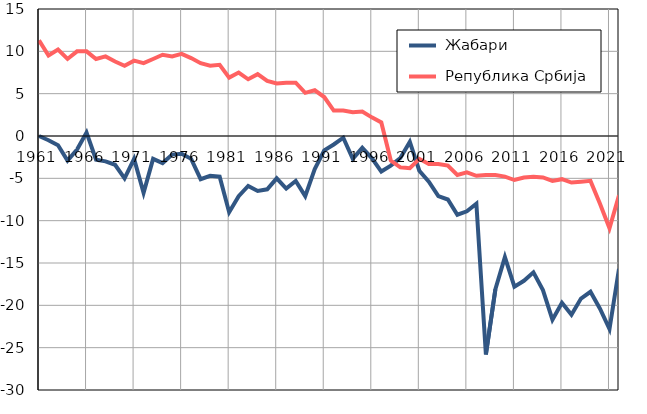
| Category |  Жабари |  Република Србија |
|---|---|---|
| 1961.0 | 0 | 11.3 |
| 1962.0 | -0.5 | 9.5 |
| 1963.0 | -1.1 | 10.2 |
| 1964.0 | -2.9 | 9.1 |
| 1965.0 | -1.6 | 10 |
| 1966.0 | 0.4 | 10 |
| 1967.0 | -2.8 | 9.1 |
| 1968.0 | -3 | 9.4 |
| 1969.0 | -3.4 | 8.8 |
| 1970.0 | -5 | 8.3 |
| 1971.0 | -2.7 | 8.9 |
| 1972.0 | -6.7 | 8.6 |
| 1973.0 | -2.7 | 9.1 |
| 1974.0 | -3.2 | 9.6 |
| 1975.0 | -2.2 | 9.4 |
| 1976.0 | -2.1 | 9.7 |
| 1977.0 | -2.7 | 9.2 |
| 1978.0 | -5.1 | 8.6 |
| 1979.0 | -4.7 | 8.3 |
| 1980.0 | -4.8 | 8.4 |
| 1981.0 | -9 | 6.9 |
| 1982.0 | -7.1 | 7.5 |
| 1983.0 | -5.9 | 6.7 |
| 1984.0 | -6.5 | 7.3 |
| 1985.0 | -6.3 | 6.5 |
| 1986.0 | -5 | 6.2 |
| 1987.0 | -6.2 | 6.3 |
| 1988.0 | -5.3 | 6.3 |
| 1989.0 | -7.1 | 5.1 |
| 1990.0 | -3.9 | 5.4 |
| 1991.0 | -1.7 | 4.6 |
| 1992.0 | -1 | 3 |
| 1993.0 | -0.2 | 3 |
| 1994.0 | -2.7 | 2.8 |
| 1995.0 | -1.4 | 2.9 |
| 1996.0 | -2.6 | 2.2 |
| 1997.0 | -4.2 | 1.6 |
| 1998.0 | -3.5 | -2.9 |
| 1999.0 | -2.6 | -3.7 |
| 2000.0 | -0.7 | -3.8 |
| 2001.0 | -4.1 | -2.7 |
| 2002.0 | -5.4 | -3.3 |
| 2003.0 | -7.1 | -3.3 |
| 2004.0 | -7.5 | -3.5 |
| 2005.0 | -9.3 | -4.6 |
| 2006.0 | -8.9 | -4.3 |
| 2007.0 | -8 | -4.7 |
| 2008.0 | -25.8 | -4.6 |
| 2009.0 | -18.1 | -4.6 |
| 2010.0 | -14.3 | -4.8 |
| 2011.0 | -17.8 | -5.2 |
| 2012.0 | -17.1 | -4.9 |
| 2013.0 | -16.1 | -4.8 |
| 2014.0 | -18.2 | -4.9 |
| 2015.0 | -21.7 | -5.3 |
| 2016.0 | -19.7 | -5.1 |
| 2017.0 | -21.1 | -5.5 |
| 2018.0 | -19.2 | -5.4 |
| 2019.0 | -18.4 | -5.3 |
| 2020.0 | -20.4 | -8 |
| 2021.0 | -22.8 | -10.9 |
| 2022.0 | -15.7 | -7 |